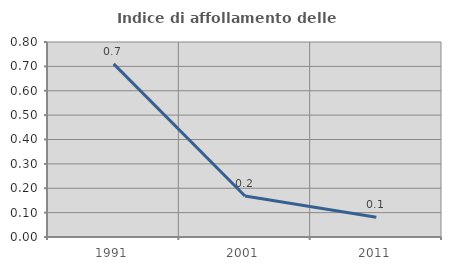
| Category | Indice di affollamento delle abitazioni  |
|---|---|
| 1991.0 | 0.71 |
| 2001.0 | 0.168 |
| 2011.0 | 0.081 |